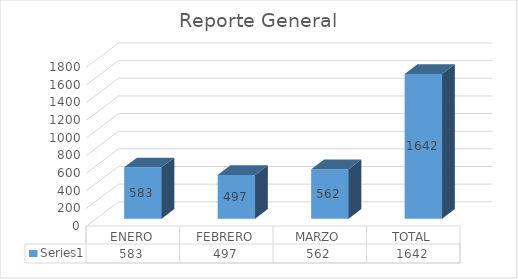
| Category | Series 0 |
|---|---|
| ENERO | 583 |
| FEBRERO | 497 |
| MARZO | 562 |
| TOTAL | 1642 |